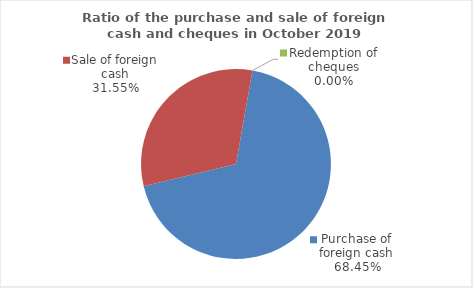
| Category | Series 0 |
|---|---|
| Purchase of foreign cash | 68.452 |
| Sale of foreign cash | 31.548 |
| Redemption of cheques | 0 |